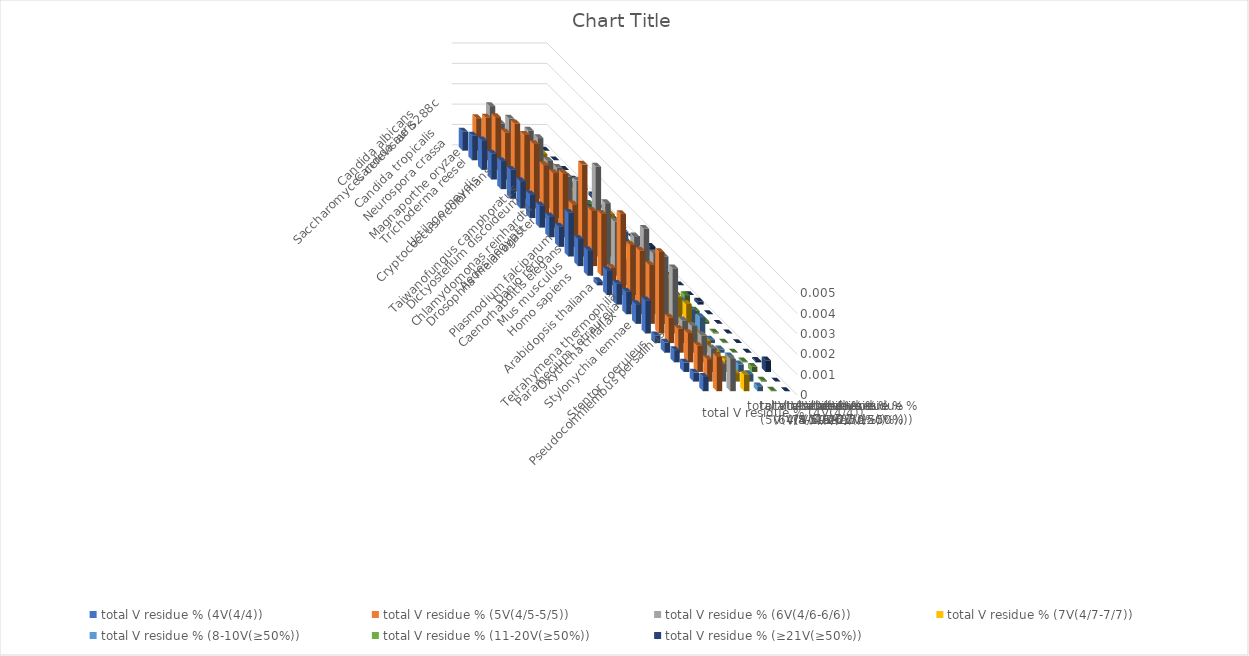
| Category | total V residue % (4V(4/4)) | total V residue % (5V(4/5-5/5)) | total V residue % (6V(4/6-6/6)) | total V residue % (7V(4/7-7/7)) | total V residue % (8-10V(≥50%)) | total V residue % (11-20V(≥50%)) | total V residue % (≥21V(≥50%)) |
|---|---|---|---|---|---|---|---|
| Saccharomyces cerevisiae S288c | 0.001 | 0.002 | 0.002 | 0.001 | 0 | 0 | 0 |
| Candida albicans | 0.001 | 0.002 | 0.002 | 0.001 | 0.001 | 0 | 0 |
| Candida auris | 0.001 | 0.003 | 0.003 | 0.001 | 0.001 | 0 | 0 |
| Candida tropicalis | 0.001 | 0.002 | 0.002 | 0.001 | 0.001 | 0 | 0 |
| Neurospora crassa | 0.001 | 0.003 | 0.003 | 0.002 | 0.001 | 0 | 0 |
| Magnaporthe oryzae | 0.001 | 0.003 | 0.003 | 0.002 | 0.001 | 0 | 0 |
| Trichoderma reesei | 0.001 | 0.003 | 0.002 | 0.001 | 0.001 | 0 | 0 |
| Cryptococcus neoformans | 0.001 | 0.003 | 0.002 | 0.001 | 0.001 | 0 | 0 |
| Ustilago maydis | 0.001 | 0.003 | 0.003 | 0.001 | 0.001 | 0 | 0 |
| Taiwanofungus camphoratus | 0.001 | 0.003 | 0.003 | 0.001 | 0.001 | 0 | 0 |
| Dictyostelium discoideum | 0.001 | 0.002 | 0.002 | 0.001 | 0.001 | 0 | 0 |
| Chlamydomonas reinhardtii | 0.002 | 0.005 | 0.004 | 0.002 | 0.001 | 0 | 0 |
| Drosophila melanogaster | 0.001 | 0.003 | 0.003 | 0.002 | 0.001 | 0 | 0 |
| Aedes aegypti | 0.001 | 0.003 | 0.003 | 0.001 | 0.001 | 0 | 0 |
| Plasmodium falciparum | 0 | 0.001 | 0.001 | 0.001 | 0 | 0 | 0 |
| Caenorhabditis elegans | 0.001 | 0.004 | 0.003 | 0.001 | 0.001 | 0 | 0 |
| Danio rerio | 0.001 | 0.003 | 0.004 | 0.002 | 0.001 | 0 | 0 |
| Mus musculus | 0.001 | 0.003 | 0.003 | 0.002 | 0.001 | 0 | 0 |
| Homo sapiens | 0.001 | 0.003 | 0.003 | 0.001 | 0.001 | 0 | 0 |
| Arabidopsis thaliana | 0.002 | 0.004 | 0.003 | 0.001 | 0.001 | 0 | 0 |
| Tetrahymena thermophila | 0 | 0.001 | 0.001 | 0.001 | 0 | 0 | 0 |
| Paramecium tetraurelia | 0 | 0.001 | 0.001 | 0.001 | 0 | 0 | 0 |
| Oxytricha trifallax | 0.001 | 0.001 | 0.001 | 0.001 | 0 | 0 | 0 |
| Stylonychia lemnae | 0 | 0.001 | 0.001 | 0.001 | 0 | 0 | 0.001 |
| Pseudocohnilembus persalinus | 0 | 0.001 | 0.001 | 0 | 0 | 0 | 0 |
| Stentor coeruleus | 0.001 | 0.002 | 0.002 | 0.001 | 0 | 0 | 0 |